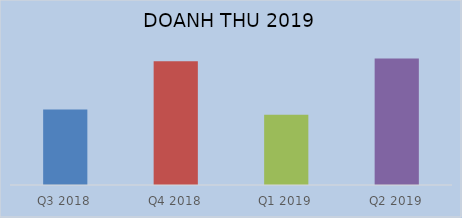
| Category | Doanh thu thuần |
|---|---|
| Q3 2018 | 23456307652239 |
| Q4 2018 | 38427135284543 |
| Q1 2019 | 21822679632050 |
| Q2 2019 | 39220453866772 |